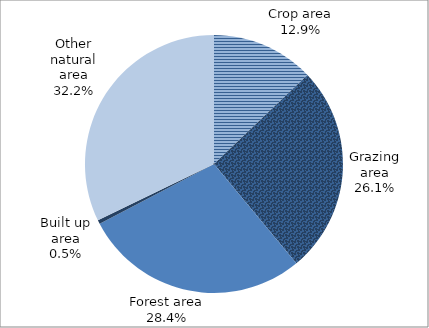
| Category | 2010 |
|---|---|
| Crop area | 0.129 |
| Grazing area | 0.261 |
| Forest area | 0.284 |
| Built up area | 0.005 |
| Other natural area | 0.322 |